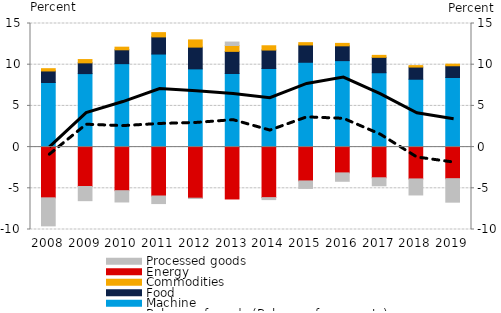
| Category | Machine | Food | Commodities | Energy | Processed goods |
|---|---|---|---|---|---|
| 2008.0 | 7.841 | 1.399 | 0.277 | -6.156 | -3.403 |
| 2009.0 | 8.919 | 1.305 | 0.4 | -4.781 | -1.72 |
| 2010.0 | 10.126 | 1.682 | 0.319 | -5.29 | -1.371 |
| 2011.0 | 11.293 | 2.079 | 0.52 | -5.933 | -0.92 |
| 2012.0 | 9.492 | 2.642 | 0.873 | -6.2 | -0.043 |
| 2013.0 | 8.929 | 2.689 | 0.711 | -6.295 | 0.421 |
| 2014.0 | 9.537 | 2.242 | 0.519 | -6.132 | -0.24 |
| 2015.0 | 10.294 | 2.1 | 0.281 | -4.106 | -0.909 |
| 2016.0 | 10.494 | 1.796 | 0.297 | -3.131 | -1.018 |
| 2017.0 | 9.024 | 1.871 | 0.238 | -3.724 | -0.97 |
| 2018.0 | 8.235 | 1.478 | 0.176 | -3.863 | -1.947 |
| 2019.0 | 8.444 | 1.427 | 0.195 | -3.832 | -2.851 |